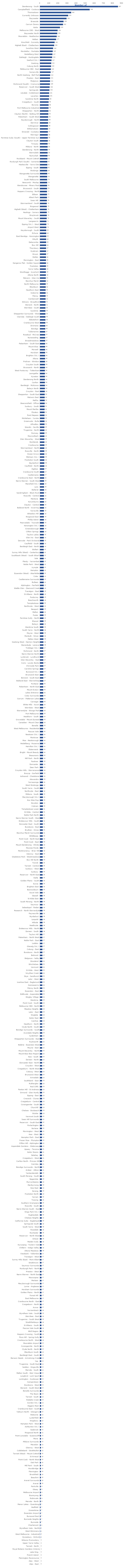
| Category | Series 0 |
|---|---|
| Dandenong - South | 857 |
| Campbellfield - Coolaroo | 546 |
| Thomastown | 343 |
| Currently Unknown | 310 |
| Bayswater | 292 |
| Braeside | 259 |
| Carrum Downs | 253 |
| Keilor | 220 |
| Melbourne CBD - West | 194 |
| Bayswater North | 190 |
| Moorabbin - Heatherton | 184 |
| Hallam | 177 |
| Knoxfield - Scoresby | 161 |
| Highett (East) - Cheltenham | 156 |
| Sunshine West | 144 |
| Mordialloc - Parkdale | 140 |
| Heidelberg West | 137 |
| Oakleigh - Huntingdale | 134 |
| Seaford (Vic.) | 127 |
| Geelong | 124 |
| Coburg North | 122 |
| Melbourne CBD - East | 120 |
| Somerville | 117 |
| North Geelong - Bell Park | 112 |
| Preston - East | 111 |
| Mulgrave | 111 |
| Richmond (South) - Cremorne | 109 |
| Reservoir - South West | 106 |
| Springvale | 104 |
| Lilydale - Coldstream | 101 |
| Laverton | 101 |
| Sunshine North | 99 |
| Craigieburn - South | 95 |
| Boronia | 95 |
| Port Melbourne Industrial | 94 |
| Shepparton - North | 93 |
| Clayton (North) - Notting Hill | 92 |
| Pakenham - South West | 90 |
| Keysborough - North | 90 |
| Derrimut | 89 |
| Collingwood | 88 |
| Williamstown | 87 |
| Emerald - Cockatoo | 87 |
| Warragul | 86 |
| Ferntree Gully (South) - Upper Ferntree Gully | 86 |
| Clayton South | 86 |
| Torquay | 84 |
| Mildura - North | 84 |
| Dandenong - North | 84 |
| Bairnsdale | 84 |
| Numurkah | 83 |
| Rockbank - Mount Cottrell | 82 |
| Roxburgh Park (South) - Somerton | 81 |
| Healesville - Yarra Glen | 81 |
| Epping - South | 81 |
| Wodonga | 80 |
| Wangaratta Surrounds | 80 |
| Wangaratta | 79 |
| South Melbourne | 79 |
| Newcomb - Moolap | 79 |
| Wendouree - Miners Rest | 78 |
| Brunswick - South | 78 |
| Hoppers Crossing - North | 77 |
| Eltham | 77 |
| Albert Park | 77 |
| Swan Hill | 76 |
| Warrnambool - South | 75 |
| Ringwood | 75 |
| Highett (West) - Cheltenham | 75 |
| Hastings - Somers | 75 |
| Braybrook | 75 |
| Mount Waverley - South | 74 |
| Langwarrin | 71 |
| Epping (Vic.) - West | 70 |
| Airport West | 70 |
| Keysborough - South | 69 |
| Echuca | 69 |
| East Bendigo - Kennington | 69 |
| Kilsyth | 68 |
| Delacombe | 68 |
| Box Hill | 68 |
| Thornbury | 67 |
| Kyabram | 67 |
| Drouin | 67 |
| Wallan | 66 |
| Mornington - East | 66 |
| Kangaroo Flat - Golden Square | 66 |
| Frankston | 66 |
| Yarra Valley | 65 |
| Wonthaggi - Inverloch | 65 |
| Altona North | 65 |
| Malvern - Glen Iris | 64 |
| Bacchus Marsh | 64 |
| North Melbourne | 63 |
| Blackburn | 63 |
| Hawthorn East | 62 |
| Gisborne | 62 |
| Fitzroy | 62 |
| Camberwell | 62 |
| Kilmore - Broadford | 61 |
| Berwick - North | 61 |
| Werribee - South | 60 |
| Sunshine | 60 |
| Shepparton Surrounds - West | 60 |
| Clarinda - Oakleigh South | 60 |
| Abbotsford | 60 |
| Cranbourne West | 59 |
| Dromana | 58 |
| Bendigo | 58 |
| Tullamarine | 57 |
| Rosebud - McCrae | 57 |
| Nunawading | 57 |
| Broadmeadows | 57 |
| Pakenham - South East | 56 |
| Mount Eliza | 56 |
| Morwell | 56 |
| Horsham | 56 |
| Brighton (Vic.) | 56 |
| Altona | 56 |
| Prahran - Windsor | 55 |
| Croydon South | 55 |
| Brunswick - North | 55 |
| West Footscray - Tottenham | 54 |
| Leongatha | 54 |
| Kyneton | 54 |
| Dandenong North | 54 |
| Carlton | 54 |
| Bentleigh - McKinnon | 54 |
| Balwyn North | 54 |
| Croydon - East | 53 |
| Shepparton - South East | 52 |
| Malvern East | 52 |
| Maffra | 52 |
| Beaconsfield - Officer | 52 |
| Sunbury - South | 51 |
| Mount Martha | 51 |
| Flinders | 51 |
| Point Nepean | 50 |
| Mickleham - Yuroke | 50 |
| Greenvale - Bulla | 50 |
| Alfredton | 50 |
| Wandin - Seville | 49 |
| Truganina - North | 49 |
| Romsey | 49 |
| Mooroolbark | 49 |
| Glen Waverley - West | 49 |
| Docklands | 49 |
| Cranbourne | 49 |
| Warrnambool - North | 48 |
| Rowville - North | 48 |
| Ocean Grove | 48 |
| Mitcham (Vic.) | 48 |
| Frankston South | 48 |
| Daylesford | 48 |
| Caulfield - North | 48 |
| Highton | 47 |
| Cranbourne South | 47 |
| Castlemaine | 47 |
| Cranbourne East - North | 46 |
| Narre Warren - South West | 45 |
| Mansfield (Vic.) | 45 |
| Lara | 45 |
| Ballarat | 45 |
| Sandringham - Black Rock | 44 |
| Rowville - Central | 44 |
| Mentone | 44 |
| Korumburra | 44 |
| Clayton - Central | 44 |
| Ballarat North - Invermay | 44 |
| Yarraville | 43 |
| Wheelers Hill | 43 |
| Ringwood East | 43 |
| Phillip Island | 43 |
| Pearcedale - Tooradin | 43 |
| Kensington (Vic.) | 43 |
| Greensborough | 43 |
| Clifton Springs | 43 |
| Taylors Lakes | 42 |
| Glen Iris - East | 42 |
| Donvale - Park Orchards | 42 |
| Caulfield - South | 42 |
| Bentleigh East - North | 42 |
| Wollert | 41 |
| Surrey Hills (West) - Canterbury | 41 |
| Southbank (West) - South Wharf | 41 |
| Sale | 41 |
| Plenty - Yarrambat | 41 |
| Noble Park - West | 41 |
| Irymple | 41 |
| Hampton | 41 |
| Essendon (West) - Aberfeldie | 41 |
| Colac | 41 |
| Castlemaine Surrounds | 41 |
| Bulleen | 41 |
| Alphington - Fairfield | 41 |
| Wattle Glen - Diamond Creek | 40 |
| Traralgon - East | 40 |
| St Albans - North | 40 |
| Footscray | 40 |
| Beechworth | 40 |
| Templestowe | 39 |
| Northcote - West | 39 |
| Newport | 39 |
| Melton | 39 |
| Foster | 39 |
| Ferntree Gully - North | 39 |
| Elwood | 39 |
| Balwyn | 39 |
| Wantirna South | 38 |
| South Yarra - North | 38 |
| Moyne - West | 38 |
| Monbulk - Silvan | 38 |
| Melton West | 38 |
| Geelong West - Hamlyn Heights | 38 |
| Baranduda - Leneva | 38 |
| Trafalgar (Vic.) | 37 |
| Richmond - North | 37 |
| Narre Warren North | 37 |
| Lynbrook - Lyndhurst | 37 |
| Glen Waverley - East | 37 |
| Corio - Lovely Banks | 37 |
| Chirnside Park | 37 |
| Caroline Springs | 37 |
| Burwood (Vic.) | 37 |
| Brunswick East | 37 |
| Berwick - South East | 37 |
| Ballarat East - Warrenheip | 37 |
| Portland | 36 |
| Pakenham - North East | 36 |
| Mount Evelyn | 36 |
| Lakes Entrance | 36 |
| Colac Surrounds | 36 |
| Carrum - Patterson Lakes | 36 |
| Carnegie | 36 |
| White Hills - Ascot | 35 |
| Werribee - West | 35 |
| Warrandyte - Wonga Park | 35 |
| Port Melbourne | 35 |
| Hawthorn - South | 35 |
| Grovedale - Mount Duneed | 35 |
| Canadian - Mount Clear | 35 |
| Benalla | 35 |
| West Melbourne - Residential | 34 |
| Pascoe Vale | 34 |
| Newtown (Vic.) | 34 |
| Montrose | 34 |
| Moe - Newborough | 34 |
| Heidelberg - Rosanna | 34 |
| Hamilton (Vic.) | 34 |
| Elsternwick | 34 |
| Bright - Mount Beauty | 34 |
| Beaumaris | 34 |
| Mill Park - North | 33 |
| Fawkner | 33 |
| Doncaster | 33 |
| Deer Park | 33 |
| Croydon Hills - Warranwood | 33 |
| Bunyip - Garfield | 33 |
| Ashwood - Chadstone | 33 |
| Alexandra | 33 |
| Yarrawonga | 32 |
| West Wodonga | 32 |
| South Yarra - South | 32 |
| Northcote - East | 32 |
| Mildura - South | 32 |
| Maryborough (Vic.) | 32 |
| Koo Wee Rup | 32 |
| Doveton | 32 |
| Cobram | 32 |
| Templestowe Lower | 31 |
| St Kilda - Central | 31 |
| Noble Park North | 31 |
| Narre Warren South - West | 31 |
| Endeavour Hills - South | 31 |
| Doncaster East - South | 31 |
| Bundoora - East | 31 |
| Bruthen - Omeo | 31 |
| Bacchus Marsh Surrounds | 31 |
| Whittlesea | 30 |
| Point Cook - North East | 30 |
| Point Cook - East | 30 |
| Mount Dandenong - Olinda | 30 |
| Moonee Ponds | 30 |
| Montmorency - Briar Hill | 30 |
| Glenroy - East | 30 |
| Gladstone Park - Westmeadows | 30 |
| Box Hill North | 30 |
| Toorak | 29 |
| Tarneit - Central | 29 |
| Sunbury - West | 29 |
| Sunbury | 29 |
| Reservoir - North East | 29 |
| Kialla | 29 |
| Golden Plains - South | 29 |
| Euroa | 29 |
| Brighton East | 29 |
| Bannockburn | 29 |
| Ascot Vale | 29 |
| Stawell | 28 |
| St Kilda East | 28 |
| South Morang - North | 28 |
| Seymour | 28 |
| Sebastopol - Redan | 28 |
| Research - North Warrandyte | 28 |
| Paynesville | 28 |
| Myrtleford | 28 |
| Leopold | 28 |
| Hillside | 28 |
| Heathcote | 28 |
| Endeavour Hills - North | 28 |
| Doreen - South | 28 |
| Taylors Hill | 27 |
| Pakenham - North West | 27 |
| Noble Park - East | 27 |
| Loddon | 27 |
| Glenelg (Vic.) | 27 |
| Coburg - East | 27 |
| Bundoora - North | 27 |
| Belmont | 27 |
| Belgrave - Selby | 27 |
| Woodend | 26 |
| Winchelsea | 26 |
| Vermont | 26 |
| St Kilda - West | 26 |
| Smythes Creek | 26 |
| Skye - Sandhurst | 26 |
| Lalor - West | 26 |
| Ivanhoe East - Eaglemont | 26 |
| Gannawarra | 26 |
| Fitzroy North | 26 |
| Essendon - East | 26 |
| Edithvale - Aspendale | 26 |
| Dingley Village | 26 |
| Wantirna | 25 |
| Point Cook - South | 25 |
| Melbourne CBD - North | 25 |
| Meadow Heights | 25 |
| Lalor - East | 25 |
| Kinglake | 25 |
| Keilor East | 25 |
| Ivanhoe | 25 |
| Hawthorn - North | 25 |
| Clyde North - South | 25 |
| Bendigo Surrounds - South | 25 |
| Avondale Heights | 25 |
| Sydenham | 24 |
| Shepparton Surrounds - East | 24 |
| Rushworth | 24 |
| Niddrie - Essendon West | 24 |
| Moyne - East | 24 |
| Mount Waverley - North | 24 |
| Mount Baw Baw Region | 24 |
| Kew - South | 24 |
| Doreen - North | 24 |
| Doncaster East - North | 24 |
| Croydon - West | 24 |
| Craigieburn - North West | 24 |
| Coburg - West | 24 |
| Brunswick West | 24 |
| Armadale | 24 |
| Southbank - East | 23 |
| Rutherglen | 23 |
| Red Cliffs | 23 |
| Panton Hill - St Andrews | 23 |
| Ormond - Glen Huntly | 23 |
| Epping - East | 23 |
| Creswick - Clunes | 23 |
| Craigieburn - Central | 23 |
| Corangamite - South | 23 |
| Churchill | 23 |
| Chelsea - Bonbeach | 23 |
| Buloke | 23 |
| Vermont South | 22 |
| Swan Hill Surrounds | 22 |
| Reservoir - South East | 22 |
| Portarlington | 22 |
| Norlane | 22 |
| Mornington - West | 22 |
| Kew - West | 22 |
| Hampton Park - East | 22 |
| Fraser Rise - Plumpton | 22 |
| Clifton Hill - Alphington | 22 |
| Aspendale Gardens - Waterways | 22 |
| Upwey - Tecoma | 21 |
| Keilor Downs | 21 |
| Delahey | 21 |
| Craigieburn - West | 21 |
| Carlton North - Princes Hill | 21 |
| Cairnlea | 21 |
| Bendigo Surrounds - North | 21 |
| Ardeer - Albion | 21 |
| Yackandandah | 20 |
| South Morang - South | 20 |
| Nagambie | 20 |
| Murrumbeena | 20 |
| Maribyrnong | 20 |
| Kew East | 20 |
| Kerang | 20 |
| Frankston North | 20 |
| Yarram | 19 |
| Towong | 19 |
| Southern Grampians | 19 |
| Rowville - South | 19 |
| Narre Warren South - East | 19 |
| Kings Park (Vic.) | 19 |
| Hughesdale | 19 |
| Chelsea Heights | 19 |
| California Gully - Eaglehawk | 19 |
| Springvale South | 18 |
| South Yarra - West | 18 |
| Rosedale | 18 |
| Rochester | 18 |
| Reservoir - North West | 18 |
| Orbost | 18 |
| Maiden Gully | 18 |
| Kurunjang - Toolern Vale | 18 |
| Chiltern - Indigo Valley | 18 |
| Altona Meadows | 18 |
| Viewbank - Yallambie | 17 |
| Traralgon - West | 17 |
| Surrey Hills (East) - Mont Albert | 17 |
| Strathmore | 17 |
| Seymour Surrounds | 17 |
| Roxburgh Park - North | 17 |
| Preston - West | 17 |
| Narre Warren - North East | 17 |
| Mooroopna | 17 |
| Merbein | 17 |
| Maryborough Surrounds | 17 |
| Lorne - Anglesea | 17 |
| Horsham Surrounds | 17 |
| Golden Plains - North | 17 |
| Forest Hill | 17 |
| East Melbourne | 17 |
| Cranbourne North - East | 17 |
| Craigieburn - North | 17 |
| Avoca | 17 |
| Yarriambiack | 16 |
| Wyndham Vale - South | 16 |
| Werribee - East | 16 |
| Truganina - South West | 16 |
| Strathfieldsaye | 16 |
| St Albans - South | 16 |
| Pascoe Vale South | 16 |
| Nhill Region | 16 |
| Hoppers Crossing - South | 16 |
| Flora Hill - Spring Gully | 16 |
| Cranbourne North - West | 16 |
| Moorabbin Airport | 15 |
| Corangamite - North | 15 |
| Clyde North - North | 15 |
| Blackburn South | 15 |
| Bentleigh East - South | 15 |
| Barwon Heads - Armstrong Creek | 15 |
| Yea | 14 |
| Truganina - South East | 14 |
| Seddon - Kingsville | 14 |
| Mernda - South | 14 |
| Melton South - Weir Views | 14 |
| Longford - Loch Sport | 14 |
| Lockington - Gunbower | 14 |
| Camperdown | 14 |
| Bundoora - West | 14 |
| Berwick - South West | 14 |
| Benalla Surrounds | 14 |
| The Basin | 13 |
| Tarneit - South | 13 |
| Riddells Creek | 13 |
| Gordon (Vic.) | 13 |
| Diggers Rest | 13 |
| Cranbourne East - South | 13 |
| Yallourn North - Glengarry | 12 |
| Watsonia | 12 |
| Lysterfield | 12 |
| Kingsbury | 12 |
| Hampton Park - West | 12 |
| Ashburton (Vic.) | 12 |
| Seabrook | 11 |
| Ringwood North | 11 |
| Point Lonsdale - Queenscliff | 11 |
| Moira | 11 |
| Mildura Surrounds | 11 |
| Macedon | 11 |
| Glenroy - West | 11 |
| Cobblebank - Strathtulloh | 11 |
| Tarneit (West) - Mount Cottrell | 10 |
| St Arnaud | 10 |
| Point Cook - North West | 10 |
| Oak Park | 10 |
| Mill Park - South | 10 |
| Hurstbridge | 10 |
| Flemington | 10 |
| Brookfield | 10 |
| Beaufort | 10 |
| Ararat Surrounds | 10 |
| Ararat | 10 |
| Parkville | 9 |
| Otway | 9 |
| Melbourne Airport | 9 |
| Buninyong | 9 |
| Robinvale | 8 |
| Mernda - North | 8 |
| Manor Lakes - Quandong | 7 |
| Hadfield | 7 |
| Gowanbrae | 7 |
| Essendon Airport | 7 |
| Burwood East | 7 |
| Burnside Heights | 7 |
| Burnside | 7 |
| Charlemont | 6 |
| Wyndham Vale - North | 4 |
| West Wimmera | 4 |
| West Melbourne - Industrial | 3 |
| Eynesbury - Exford | 3 |
| Wilsons Promontory | 0 |
| Upper Yarra Valley | 0 |
| Tarneit - North | 0 |
| Royal Botanic Gardens Victoria | 0 |
| Lake King | 0 |
| French Island | 0 |
| Flemington Racecourse | 0 |
| Alps - West | 0 |
| Alps - East | 0 |